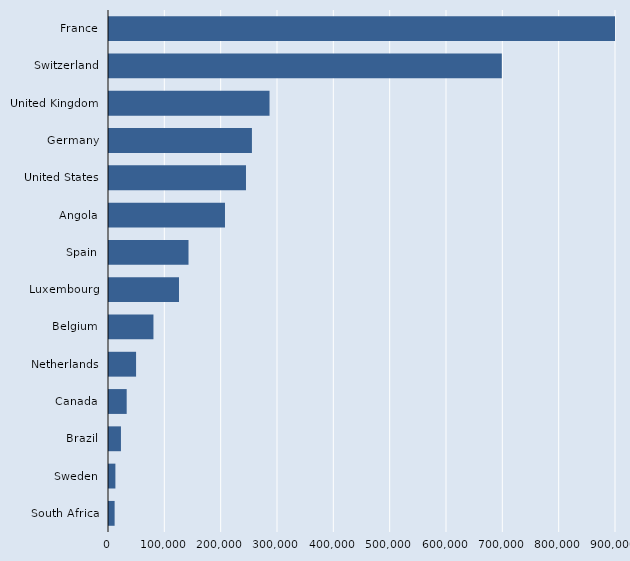
| Category | Series 2 |
|---|---|
| France | 1122570 |
| Switzerland | 697280 |
| United Kingdom | 284970 |
| Germany | 253710 |
| United States | 243170 |
| Angola | 205890 |
| Spain | 141140 |
| Luxembourg | 124260 |
| Belgium | 78900 |
| Netherlands | 48060 |
| Canada | 31400 |
| Brazil | 21200 |
| Sweden | 11360 |
| South Africa | 9980 |